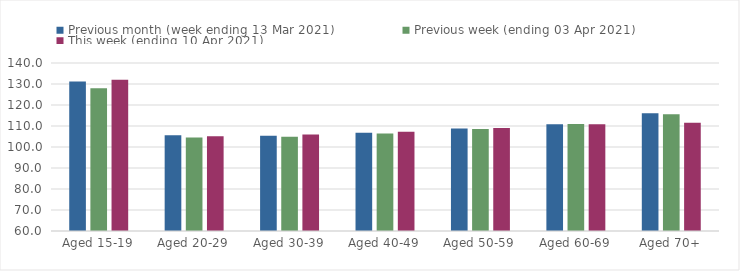
| Category | Previous month (week ending 13 Mar 2021) | Previous week (ending 03 Apr 2021) | This week (ending 10 Apr 2021) |
|---|---|---|---|
| Aged 15-19 | 131.14 | 127.99 | 132.07 |
| Aged 20-29 | 105.63 | 104.49 | 105.17 |
| Aged 30-39 | 105.4 | 104.94 | 105.9 |
| Aged 40-49 | 106.84 | 106.45 | 107.26 |
| Aged 50-59 | 108.81 | 108.52 | 109.1 |
| Aged 60-69 | 110.87 | 110.9 | 110.85 |
| Aged 70+ | 116.08 | 115.61 | 111.58 |